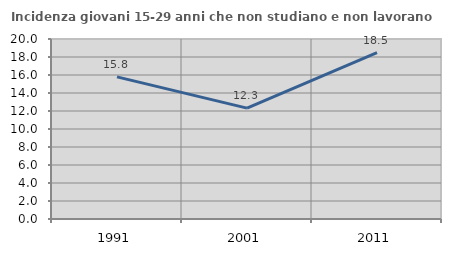
| Category | Incidenza giovani 15-29 anni che non studiano e non lavorano  |
|---|---|
| 1991.0 | 15.789 |
| 2001.0 | 12.322 |
| 2011.0 | 18.487 |